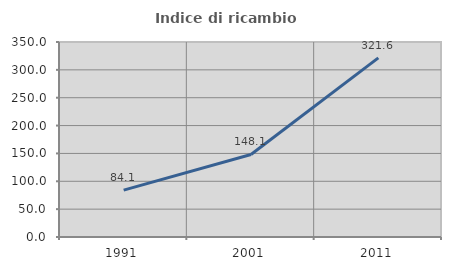
| Category | Indice di ricambio occupazionale  |
|---|---|
| 1991.0 | 84.059 |
| 2001.0 | 148.128 |
| 2011.0 | 321.6 |